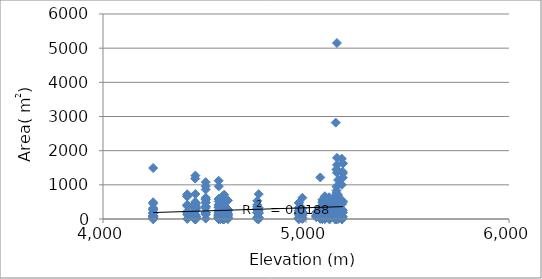
| Category | Area (m2) |
|---|---|
| 5050.871999999999 | 77 |
| 5050.871999999999 | 52.8 |
| 5050.871999999999 | 80 |
| 5050.871999999999 | 198 |
| 5050.871999999999 | 101.5 |
| 5050.871999999999 | 100.1 |
| 5070.36 | 4.4 |
| 5070.36 | 23.52 |
| 5070.36 | 29.7 |
| 5070.36 | 107.01 |
| 5070.36 | 13.64 |
| 5070.36 | 125.46 |
| 5070.36 | 33.48 |
| 5070.36 | 1216 |
| 5070.36 | 17.4 |
| 5070.36 | 188.6 |
| 5070.36 | 181.25 |
| 5070.36 | 341.88 |
| 5070.36 | 40.8 |
| 5080.451999999999 | 347.17 |
| 5080.451999999999 | 151.2 |
| 5080.451999999999 | 48 |
| 5080.451999999999 | 39.2 |
| 5080.451999999999 | 168.75 |
| 5080.451999999999 | 53.95 |
| 5080.451999999999 | 127.5 |
| 5080.451999999999 | 562.31 |
| 5080.451999999999 | 174.02 |
| 5080.451999999999 | 85.56 |
| 5080.451999999999 | 167.04 |
| 5080.451999999999 | 0.72 |
| 5080.451999999999 | 178.36 |
| 5080.451999999999 | 486.42 |
| 5080.451999999999 | 27.2 |
| 5080.451999999999 | 1.12 |
| 5092.98 | 94.8 |
| 5092.98 | 571.2 |
| 5092.98 | 162.5 |
| 5092.98 | 610.7 |
| 5092.98 | 4.76 |
| 5092.98 | 30.66 |
| 5092.98 | 666.25 |
| 5092.98 | 0.84 |
| 5092.98 | 196.85 |
| 5092.98 | 255.75 |
| 5092.98 | 212.48 |
| 5092.98 | 119.32 |
| 4454.0 | 499.2 |
| 4454.0 | 13.65 |
| 4454.0 | 0.2 |
| 4454.0 | 0.1 |
| 4454.0 | 85.05 |
| 4454.0 | 66.64 |
| 4454.0 | 296.4 |
| 4454.0 | 306.6 |
| 4454.0 | 0.84 |
| 4454.0 | 336.3 |
| 4454.0 | 270.1 |
| 4454.0 | 136.12 |
| 4454.0 | 66.6 |
| 4454.0 | 1 |
| 4454.0 | 223.6 |
| 4454.0 | 1181.95 |
| 4454.0 | 35.5 |
| 4454.0 | 0.12 |
| 4454.0 | 106.72 |
| 4454.0 | 303.84 |
| 4454.0 | 0.24 |
| 5143.44 | 338.52 |
| 5143.44 | 205.7 |
| 5143.44 | 664.7 |
| 5143.44 | 0.02 |
| 5143.44 | 0.28 |
| 5143.44 | 425.5 |
| 5143.44 | 438.9 |
| 5143.44 | 8.32 |
| 5143.44 | 629.1 |
| 5143.44 | 123.5 |
| 5143.44 | 281.2 |
| 5143.44 | 80 |
| 5143.44 | 8.16 |
| 5143.44 | 86.7 |
| 5150.052 | 671.3 |
| 5150.052 | 0.12 |
| 5150.052 | 1450.8 |
| 5150.052 | 753.74 |
| 5150.052 | 36.96 |
| 5150.052 | 0.01 |
| 5150.052 | 0.08 |
| 5150.052 | 652.72 |
| 5150.052 | 0.21 |
| 5150.052 | 949.44 |
| 5150.052 | 189.75 |
| 5150.052 | 829.8 |
| 5150.052 | 196 |
| 5150.052 | 45 |
| 5146.571999999999 | 2821 |
| 5146.571999999999 | 281.2 |
| 5146.571999999999 | 116.25 |
| 5146.571999999999 | 362.95 |
| 5146.571999999999 | 261.8 |
| 5146.571999999999 | 1.36 |
| 5146.571999999999 | 592.79 |
| 5146.571999999999 | 81.34 |
| 5146.571999999999 | 550.02 |
| 5146.571999999999 | 183.6 |
| 5146.571999999999 | 370.5 |
| 5146.571999999999 | 180.48 |
| 5152.487999999999 | 5150.25 |
| 5152.487999999999 | 1584 |
| 5152.487999999999 | 627.38 |
| 5152.487999999999 | 1440 |
| 5152.487999999999 | 509.6 |
| 5152.487999999999 | 0.7 |
| 5152.487999999999 | 78.02 |
| 5152.487999999999 | 222.25 |
| 5152.487999999999 | 44.94 |
| 5152.487999999999 | 1789.3 |
| 5152.487999999999 | 1353.78 |
| 5152.487999999999 | 221 |
| 5158.056 | 580.5 |
| 5158.056 | 510 |
| 5158.056 | 126 |
| 5158.056 | 590.4 |
| 5158.056 | 117.15 |
| 5158.056 | 139.5 |
| 5158.056 | 206.08 |
| 5158.056 | 1142.15 |
| 5158.056 | 700 |
| 5158.056 | 251.6 |
| 5158.056 | 1.08 |
| 5158.056 | 225 |
| 5158.056 | 176.7 |
| 5158.056 | 222.4 |
| 5158.056 | 133.5 |
| 5158.056 | 275.55 |
| 5158.056 | 166.75 |
| 5158.056 | 55 |
| 5158.056 | 646 |
| 5158.056 | 65.45 |
| 5158.056 | 389.4 |
| 5181.719999999999 | 1209 |
| 5181.719999999999 | 192.57 |
| 5181.719999999999 | 1620 |
| 5181.719999999999 | 522.5 |
| 5181.719999999999 | 1378.46 |
| 5181.719999999999 | 249.2 |
| 5181.719999999999 | 1632 |
| 5181.719999999999 | 1339.4 |
| 5181.719999999999 | 492.9 |
| 5181.719999999999 | 65.25 |
| 5176.5 | 259.16 |
| 5176.5 | 1763 |
| 5176.5 | 1356 |
| 5176.5 | 1000.5 |
| 5176.5 | 0.12 |
| 5176.5 | 433.4 |
| 5176.5 | 40 |
| 5176.5 | 290 |
| 5176.5 | 0.03 |
| 5176.5 | 0.35 |
| 5176.5 | 277.5 |
| 5176.5 | 0.12 |
| 5176.5 | 9 |
| 5176.5 | 252.58 |
| 5176.5 | 104.5 |
| 5176.5 | 51.84 |
| 5176.5 | 1.54 |
| 5176.5 | 161 |
| 5116.991999999999 | 232.5 |
| 5116.991999999999 | 563.75 |
| 5116.991999999999 | 2.75 |
| 5116.991999999999 | 523.02 |
| 5116.991999999999 | 515.29 |
| 5116.991999999999 | 494 |
| 5116.991999999999 | 214.5 |
| 5116.991999999999 | 95 |
| 5116.991999999999 | 0.48 |
| 5116.991999999999 | 49.8 |
| 5116.991999999999 | 260.52 |
| 5116.991999999999 | 1.82 |
| 5116.991999999999 | 256.62 |
| 5116.991999999999 | 216.24 |
| 5113.512 | 213.2 |
| 5113.512 | 149.6 |
| 5113.512 | 621 |
| 5113.512 | 262.8 |
| 5113.512 | 142.74 |
| 5113.512 | 413.4 |
| 5113.512 | 222.44 |
| 5113.512 | 68.62 |
| 5113.512 | 107.07 |
| 5113.512 | 0.48 |
| 5113.512 | 636.4 |
| 5113.512 | 153.9 |
| 5113.512 | 369.9 |
| 4982.0 | 166.5 |
| 4982.0 | 306.25 |
| 4982.0 | 13.63 |
| 4982.0 | 3.99 |
| 4982.0 | 205.5 |
| 4982.0 | 142 |
| 4982.0 | 196.1 |
| 4982.0 | 621.81 |
| 4982.0 | 39.9 |
| 4982.0 | 211.46 |
| 4982.0 | 102 |
| 4982.0 | 183.58 |
| 4965.0 | 308.7 |
| 4965.0 | 44.24 |
| 4965.0 | 141.44 |
| 4965.0 | 0.48 |
| 4965.0 | 162.54 |
| 4965.0 | 331.2 |
| 4965.0 | 194.56 |
| 4965.0 | 122.4 |
| 4965.0 | 0.48 |
| 4965.0 | 474.28 |
| 4965.0 | 471.5 |
| 4965.0 | 248.82 |
| 4965.0 | 18.6 |
| 4965.0 | 240.34 |
| 4592.0 | 198.73 |
| 4592.0 | 241.78 |
| 4592.0 | 0.08 |
| 4592.0 | 154.94 |
| 4592.0 | 388.05 |
| 4592.0 | 405.46 |
| 4592.0 | 0.3 |
| 4592.0 | 27.28 |
| 4592.0 | 469.3 |
| 4592.0 | 14 |
| 4592.0 | 199.2 |
| 4592.0 | 228.62 |
| 4592.0 | 58.22 |
| 4592.0 | 43.2 |
| 4592.0 | 304.3 |
| 4597.0 | 85.36 |
| 4597.0 | 15.98 |
| 4597.0 | 267.26 |
| 4597.0 | 0.02 |
| 4597.0 | 710.65 |
| 4597.0 | 72 |
| 4597.0 | 182.88 |
| 4597.0 | 7.74 |
| 4597.0 | 395.5 |
| 4597.0 | 146.9 |
| 4597.0 | 387.73 |
| 4597.0 | 132.48 |
| 4570.0 | 346.94 |
| 4570.0 | 514.6 |
| 4570.0 | 580.5 |
| 4570.0 | 587.05 |
| 4570.0 | 1.82 |
| 4570.0 | 1120.55 |
| 4570.0 | 138.92 |
| 4570.0 | 242.2 |
| 4570.0 | 139.1 |
| 4570.0 | 407.88 |
| 4570.0 | 335.62 |
| 4570.0 | 52.25 |
| 4570.0 | 954 |
| 4570.0 | 7.98 |
| 4570.0 | 39.2 |
| 4570.0 | 197.12 |
| 4570.0 | 2.3 |
| 4570.0 | 167.79 |
| 4579.0 | 367.4 |
| 4579.0 | 361.4 |
| 4579.0 | 387.45 |
| 4579.0 | 503.28 |
| 4579.0 | 278.2 |
| 4579.0 | 0.42 |
| 4579.0 | 279.38 |
| 4579.0 | 0.8 |
| 4579.0 | 141.57 |
| 4590.0 | 669.9 |
| 4590.0 | 230.55 |
| 4590.0 | 124.67 |
| 4590.0 | 341.12 |
| 4590.0 | 111.02 |
| 4590.0 | 107 |
| 4590.0 | 170.98 |
| 4590.0 | 0.1 |
| 4590.0 | 2.75 |
| 4615.0 | 283.68 |
| 4615.0 | 43.2 |
| 4615.0 | 236.22 |
| 4615.0 | 260.64 |
| 4615.0 | 59.28 |
| 4615.0 | 4.37 |
| 4615.0 | 542.53 |
| 4615.0 | 165.77 |
| 4615.0 | 130.4 |
| 4615.0 | 4.76 |
| 4615.0 | 7.59 |
| 4615.0 | 12.24 |
| 4615.0 | 16 |
| 4615.0 | 123.75 |
| 4615.0 | 44.4 |
| 4615.0 | 97.82 |
| 4767.0 | 328.86 |
| 4767.0 | 728 |
| 4767.0 | 45.1 |
| 4767.0 | 165.6 |
| 4767.0 | 42 |
| 4767.0 | 184.76 |
| 4767.0 | 0.96 |
| 4767.0 | 0.6 |
| 4767.0 | 249.2 |
| 4760.0 | 416.05 |
| 4760.0 | 285.58 |
| 4760.0 | 3.15 |
| 4760.0 | 309.88 |
| 4760.0 | 191.4 |
| 4760.0 | 372.6 |
| 4760.0 | 21.6 |
| 4760.0 | 276.32 |
| 4760.0 | 178 |
| 4760.0 | 49.5 |
| 4760.0 | 353.7 |
| 4760.0 | 531 |
| 4506.0 | 184.5 |
| 4506.0 | 366.4 |
| 4506.0 | 958.9 |
| 4506.0 | 475.6 |
| 4506.0 | 1077.12 |
| 4506.0 | 194.7 |
| 4506.0 | 488.94 |
| 4506.0 | 12 |
| 4506.0 | 864 |
| 4506.0 | 624 |
| 4506.0 | 579.6 |
| 4506.0 | 362.1 |
| 4506.0 | 568.65 |
| 4506.0 | 142.6 |
| 4506.0 | 323.08 |
| 4506.0 | 134.55 |
| 4415.0 | 416.5 |
| 4415.0 | 184.5 |
| 4415.0 | 214.4 |
| 4415.0 | 131.04 |
| 4415.0 | 658.8 |
| 4415.0 | 663 |
| 4415.0 | 723.8 |
| 4415.0 | 0.44 |
| 4415.0 | 391.4 |
| 4415.0 | 379.25 |
| 4415.0 | 703 |
| 4455.0 | 443.7 |
| 4455.0 | 322.89 |
| 4455.0 | 8.5 |
| 4455.0 | 339.2 |
| 4455.0 | 342 |
| 4455.0 | 72.8 |
| 4455.0 | 1269.82 |
| 4455.0 | 332.5 |
| 4455.0 | 731.4 |
| 4247.0 | 270.04 |
| 4247.0 | 304.2 |
| 4247.0 | 489.51 |
| 4247.0 | 42.88 |
| 4247.0 | 93.73 |
| 4247.0 | 96.8 |
| 4247.0 | 321.6 |
| 4247.0 | 85 |
| 4247.0 | 163.8 |
| 4247.0 | 1491.6 |
| 4247.0 | 182.5 |
| 4247.0 | 2.55 |
| 4247.0 | 11.22 |
| 4247.0 | 0.8 |
| 4247.0 | 68 |
| 4247.0 | 93.28 |
| 4247.0 | 260.48 |
| 4247.0 | 450.84 |
| 4247.0 | 78.3 |
| 4247.0 | 171.68 |
| 4247.0 | 11.88 |
| 4247.0 | 175.26 |
| 4247.0 | 9.92 |
| 4247.0 | 30.25 |
| 4457.0 | 456.27 |
| 4457.0 | 0.4 |
| 4457.0 | 88.5 |
| 4457.0 | 70.08 |
| 4457.0 | 1.26 |
| 4457.0 | 296.84 |
| 4457.0 | 46.97 |
| 4457.0 | 367.5 |
| 4457.0 | 77.4 |
| 4457.0 | 293.15 |
| 4457.0 | 2.7 |
| 4457.0 | 45.36 |
| 4457.0 | 442.15 |
| 4570.0 | 105 |
| 4570.0 | 416.16 |
| 4570.0 | 79.56 |
| 4570.0 | 255.2 |
| 4570.0 | 39.53 |
| 4570.0 | 0.45 |
| 4570.0 | 3.36 |
| 4570.0 | 109.74 |
| 4570.0 | 67.98 |
| 4570.0 | 47.52 |
| 4570.0 | 143.56 |